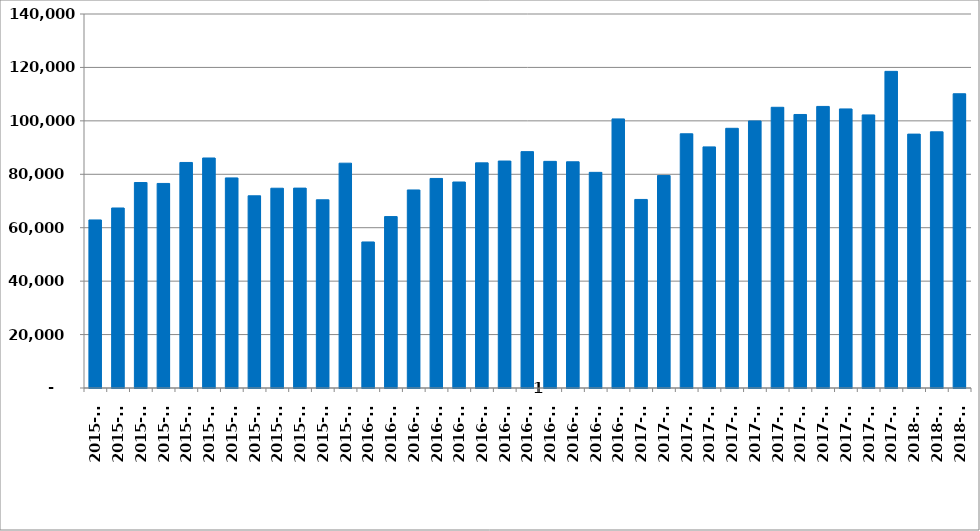
| Category | ფულადი გზავნილები სულ |
|---|---|
| 2015-01 | 62908.96 |
| 2015-02 | 67382.448 |
| 2015-03 | 76916.487 |
| 2015-04 | 76570.981 |
| 2015-05 | 84424.274 |
| 2015-06 | 86099.207 |
| 2015-07 | 78641.132 |
| 2015-08 | 71947.484 |
| 2015-09 | 74780.377 |
| 2015-10 | 74824.958 |
| 2015-11 | 70452.204 |
| 2015-12 | 84159.758 |
| 2016-01 | 54668.843 |
| 2016-02 | 64166.493 |
| 2016-03 | 74135.096 |
| 2016-04 | 78445.112 |
| 2016-05 | 77110.878 |
| 2016-06 | 84274.721 |
| 2016-07 | 84960.145 |
| 2016-08 | 88481.217 |
| 2016-09 | 84837.493 |
| 2016-10 | 84680.75 |
| 2016-11 | 80721.619 |
| 2016-12 | 100726.99 |
| 2017-01 | 70579.425 |
| 2017-02 | 79529.997 |
| 2017-03 | 95158.098 |
| 2017-04 | 90258.382 |
| 2017-05 | 97211.593 |
| 2017-06 | 99965.514 |
| 2017-07 | 105079.971 |
| 2017-08 | 102386.889 |
| 2017-09 | 105398.216 |
| 2017-10 | 104465.995 |
| 2017-11 | 102226.413 |
| 2017-12 | 118523.565 |
| 2018-01 | 95034.354 |
| 2018-02 | 95897.356 |
| 2018-03 | 110142.866 |